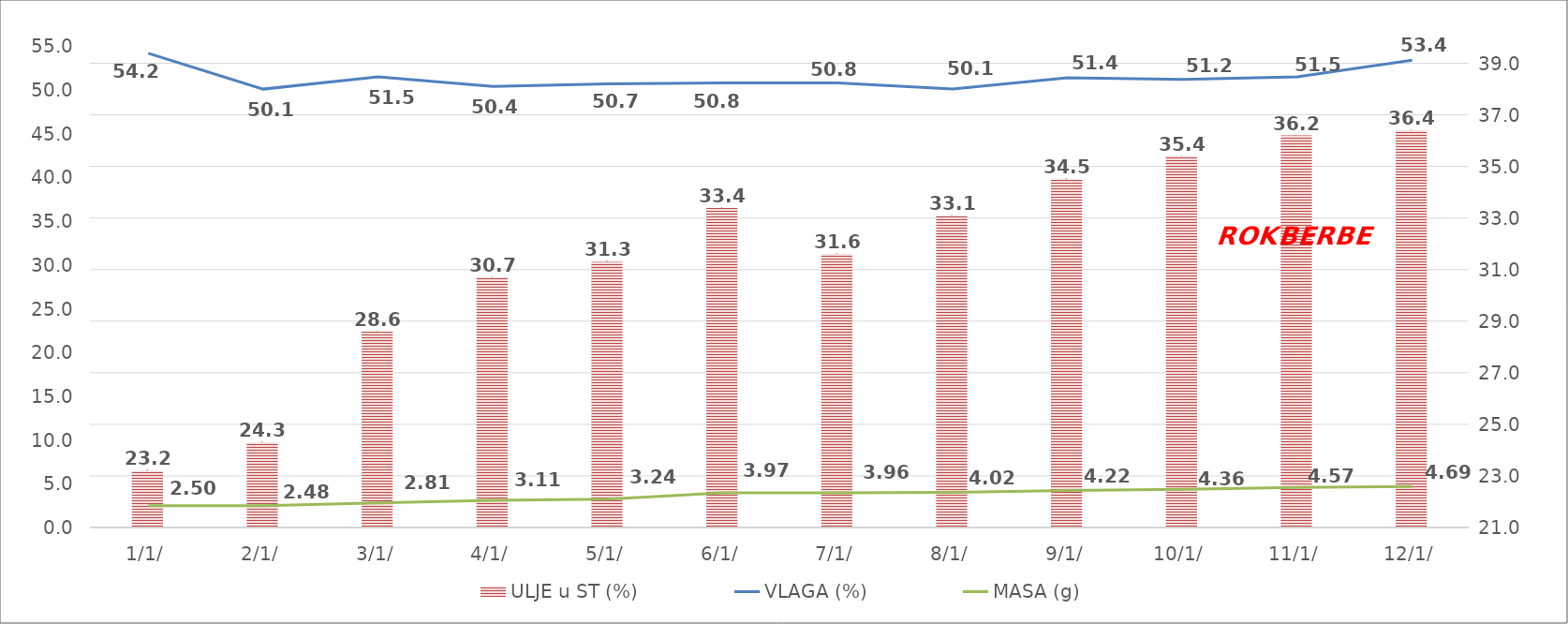
| Category | ULJE u ST (%) |
|---|---|
| 0 | 23.2 |
| 1900-01-01 | 24.3 |
| 1900-01-02 | 28.6 |
| 1900-01-03 | 30.7 |
| 1900-01-04 | 31.3 |
| 1900-01-05 | 33.4 |
| 1900-01-06 | 31.6 |
| 1900-01-07 | 33.1 |
| 1900-01-08 | 34.5 |
| 1900-01-09 | 35.4 |
| 1900-01-10 | 36.2 |
| 1900-01-11 | 36.4 |